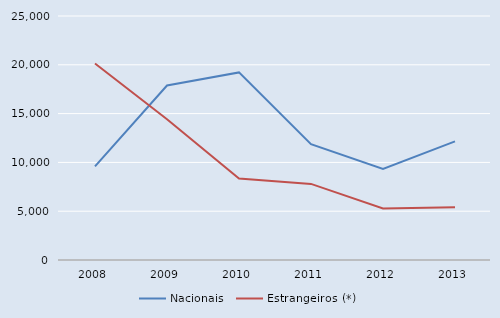
| Category | Nacionais | Estrangeiros (*) |
|---|---|---|
| 2008.0 | 9586 | 20132 |
| 2009.0 | 17883 | 14424 |
| 2010.0 | 19222 | 8353 |
| 2011.0 | 11872 | 7795 |
| 2012.0 | 9334 | 5272 |
| 2013.0 | 12156 | 5398 |